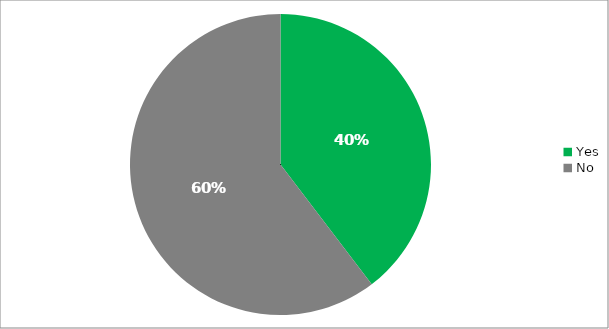
| Category | Responses |
|---|---|
| Yes | 0.396 |
| No | 0.604 |